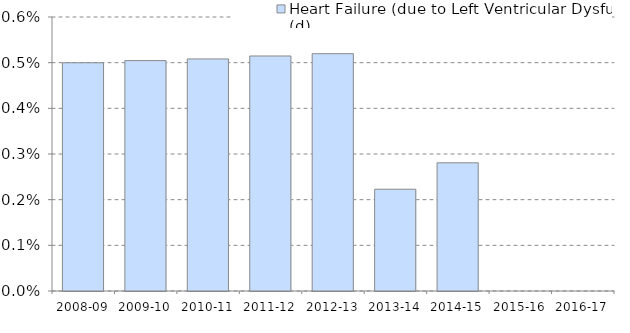
| Category | Heart Failure (due to Left Ventricular Dysfunction) (d) |
|---|---|
| 2008-09 | 0.005 |
| 2009-10 | 0.005 |
| 2010-11 | 0.005 |
| 2011-12 | 0.005 |
| 2012-13 | 0.005 |
| 2013-14 | 0.002 |
| 2014-15 | 0.003 |
| 2015-16 | 0 |
| 2016-17 | 0 |